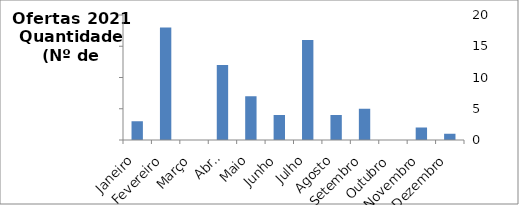
| Category | Nº |
|---|---|
| Janeiro | 3 |
| Fevereiro | 18 |
| Março | 0 |
| Abril | 12 |
| Maio | 7 |
| Junho | 4 |
| Julho | 16 |
| Agosto | 4 |
| Setembro | 5 |
| Outubro | 0 |
| Novembro | 2 |
| Dezembro | 1 |